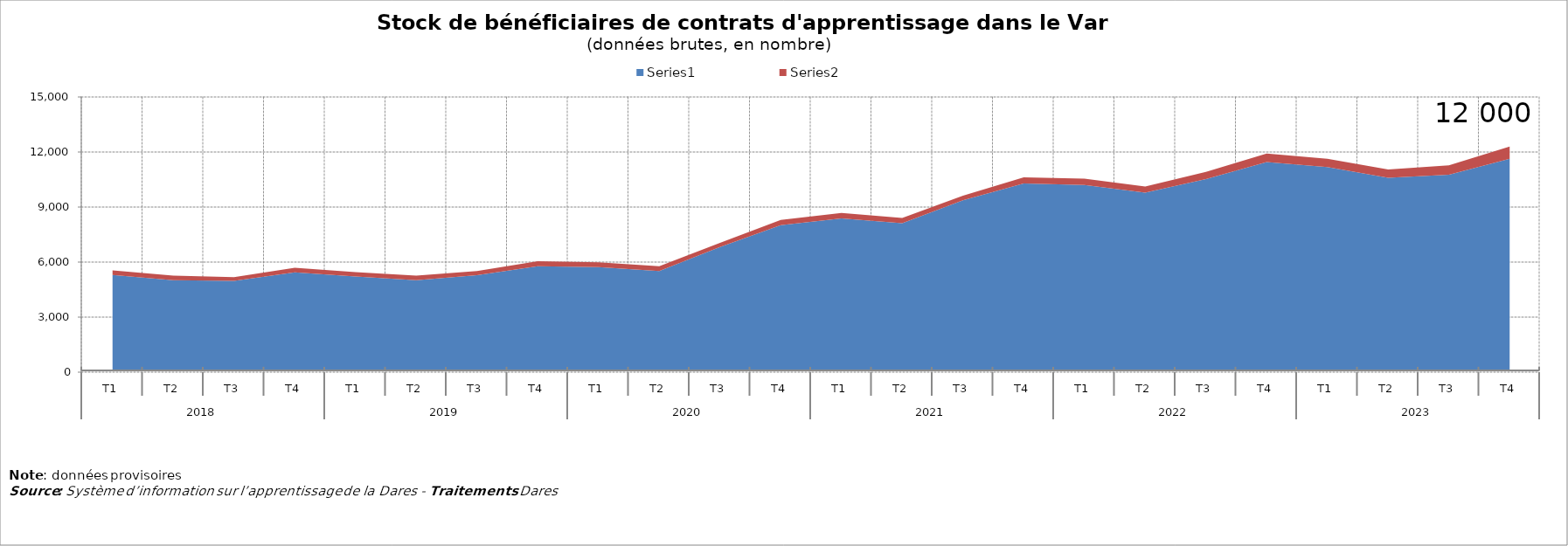
| Category | Series 0 | Series 1 |
|---|---|---|
| 0 | 5292 | 257 |
| 1 | 5013 | 249 |
| 2 | 4981 | 203 |
| 3 | 5436 | 250 |
| 4 | 5216 | 242 |
| 5 | 5017 | 240 |
| 6 | 5281 | 229 |
| 7 | 5779 | 267 |
| 8 | 5731 | 263 |
| 9 | 5514 | 259 |
| 10 | 6823 | 226 |
| 11 | 8013 | 285 |
| 12 | 8385 | 294 |
| 13 | 8116 | 287 |
| 14 | 9368 | 252 |
| 15 | 10281 | 343 |
| 16 | 10204 | 344 |
| 17 | 9783 | 337 |
| 18 | 10529 | 387 |
| 19 | 11458 | 460 |
| 20 | 11174 | 458 |
| 21 | 10600 | 445 |
| 22 | 10766 | 511 |
| 23 | 11634 | 661 |